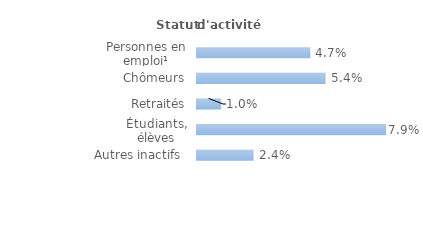
| Category | Series 0 |
|---|---|
| Personnes en emploi¹ | 0.047 |
| Chômeurs | 0.054 |
| Retraités | 0.01 |
| Étudiants, élèves | 0.079 |
| Autres inactifs  | 0.024 |